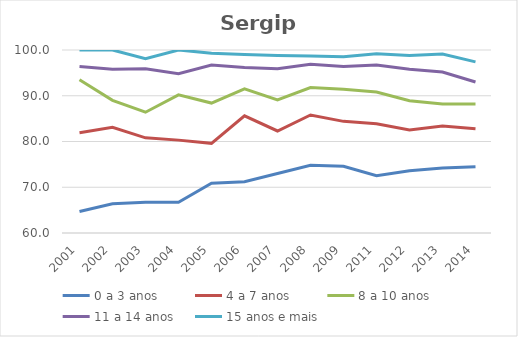
| Category | 0 a 3 anos | 4 a 7 anos | 8 a 10 anos | 11 a 14 anos | 15 anos e mais |
|---|---|---|---|---|---|
| 2001.0 | 64.7 | 81.9 | 93.5 | 96.4 | 100 |
| 2002.0 | 66.4 | 83.1 | 89 | 95.8 | 100 |
| 2003.0 | 66.7 | 80.8 | 86.4 | 95.9 | 98.1 |
| 2004.0 | 66.7 | 80.3 | 90.2 | 94.8 | 100 |
| 2005.0 | 70.9 | 79.6 | 88.4 | 96.7 | 99.3 |
| 2006.0 | 71.2 | 85.6 | 91.5 | 96.2 | 99 |
| 2007.0 | 73 | 82.3 | 89.1 | 95.9 | 98.8 |
| 2008.0 | 74.8 | 85.8 | 91.8 | 96.9 | 98.7 |
| 2009.0 | 74.6 | 84.4 | 91.4 | 96.4 | 98.5 |
| 2011.0 | 72.5 | 83.9 | 90.8 | 96.7 | 99.2 |
| 2012.0 | 73.6 | 82.5 | 88.9 | 95.8 | 98.8 |
| 2013.0 | 74.2 | 83.4 | 88.2 | 95.2 | 99.1 |
| 2014.0 | 74.5 | 82.8 | 88.2 | 93 | 97.4 |